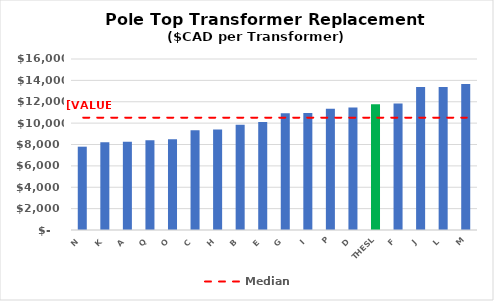
| Category | Series 0 |
|---|---|
| N | 7795.996 |
| K | 8203.453 |
| A | 8247.621 |
| Q | 8391.089 |
| O | 8493.112 |
| C | 9343.203 |
| H | 9412.184 |
| B | 9842.599 |
| E | 10101.461 |
| G | 10927.328 |
| I | 10954.207 |
| P | 11354.865 |
| D | 11465.57 |
| THESL | 11761 |
| F | 11825.395 |
| J | 13376.966 |
| L | 13382.214 |
| M | 13664.379 |